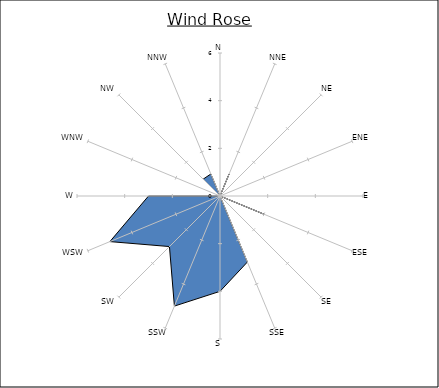
| Category | Series 0 |
|---|---|
| N | 0 |
| NNE | 1 |
| NE | 0 |
| ENE | 0 |
| E | 0 |
| ESE | 2 |
| SE | 0 |
| SSE | 3 |
| S | 4 |
| SSW | 5 |
| SW | 3 |
| WSW | 5 |
| W | 3 |
| WNW | 0 |
| NW | 1 |
| NNW | 1 |